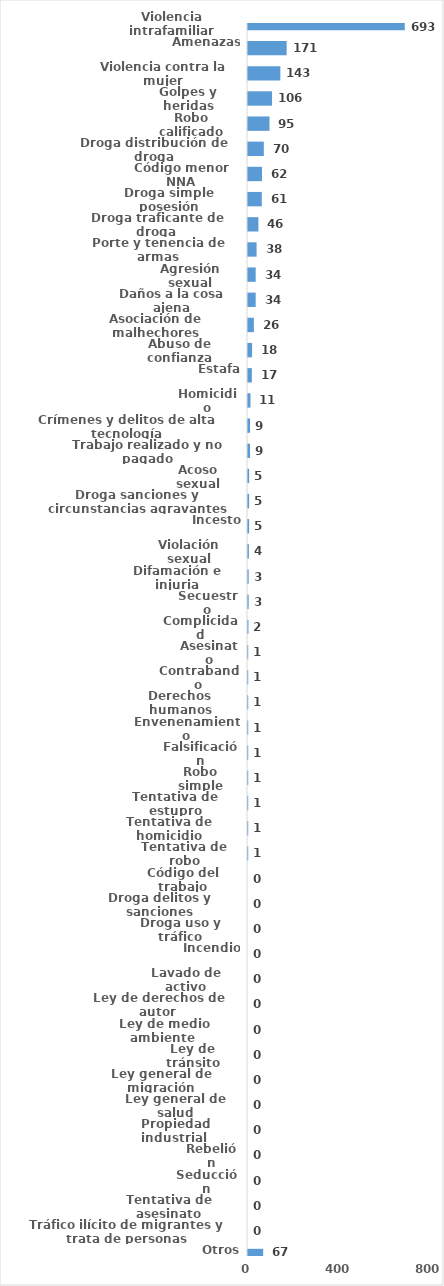
| Category | Series 0 |
|---|---|
| Violencia intrafamiliar | 693 |
| Amenazas | 171 |
| Violencia contra la mujer | 143 |
| Golpes y heridas | 106 |
| Robo calificado | 95 |
| Droga distribución de droga | 70 |
| Código menor NNA | 62 |
| Droga simple posesión | 61 |
| Droga traficante de droga  | 46 |
| Porte y tenencia de armas | 38 |
| Agresión sexual | 34 |
| Daños a la cosa ajena | 34 |
| Asociación de malhechores | 26 |
| Abuso de confianza | 18 |
| Estafa | 17 |
| Homicidio | 11 |
| Crímenes y delitos de alta tecnología | 9 |
| Trabajo realizado y no pagado | 9 |
| Acoso sexual | 5 |
| Droga sanciones y circunstancias agravantes | 5 |
| Incesto | 5 |
| Violación sexual | 4 |
| Difamación e injuria | 3 |
| Secuestro | 3 |
| Complicidad | 2 |
| Asesinato | 1 |
| Contrabando | 1 |
| Derechos humanos | 1 |
| Envenenamiento | 1 |
| Falsificación | 1 |
| Robo simple | 1 |
| Tentativa de estupro | 1 |
| Tentativa de homicidio | 1 |
| Tentativa de robo | 1 |
| Código del trabajo | 0 |
| Droga delitos y sanciones | 0 |
| Droga uso y tráfico | 0 |
| Incendio | 0 |
| Lavado de activo | 0 |
| Ley de derechos de autor  | 0 |
| Ley de medio ambiente  | 0 |
| Ley de tránsito | 0 |
| Ley general de migración | 0 |
| Ley general de salud | 0 |
| Propiedad industrial  | 0 |
| Rebelión | 0 |
| Seducción | 0 |
| Tentativa de asesinato | 0 |
| Tráfico ilícito de migrantes y trata de personas | 0 |
| Otros | 67 |